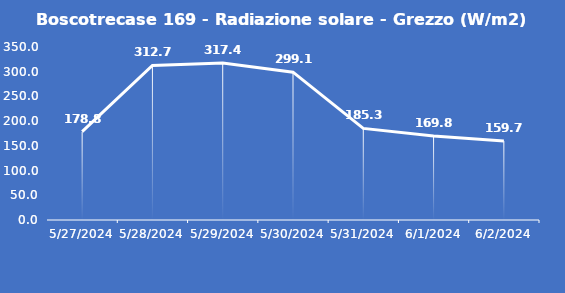
| Category | Boscotrecase 169 - Radiazione solare - Grezzo (W/m2) |
|---|---|
| 5/27/24 | 178.8 |
| 5/28/24 | 312.7 |
| 5/29/24 | 317.4 |
| 5/30/24 | 299.1 |
| 5/31/24 | 185.3 |
| 6/1/24 | 169.8 |
| 6/2/24 | 159.7 |